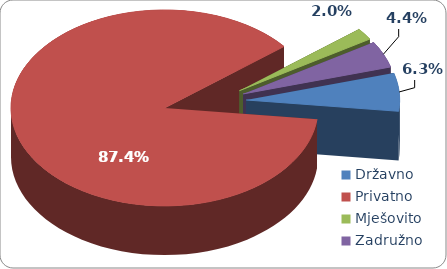
| Category | Ukupan prihod |
|---|---|
| Državno | 660292.839 |
| Privatno | 9177783.501 |
| Mješovito | 206326.154 |
| Zadružno | 461981.376 |